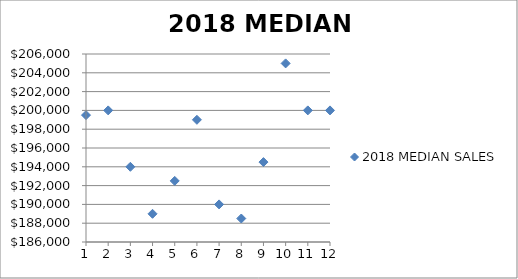
| Category | 2018 MEDIAN SALES |
|---|---|
| 1.0 | 199500 |
| 2.0 | 200000 |
| 3.0 | 194000 |
| 4.0 | 189000 |
| 5.0 | 192500 |
| 6.0 | 199000 |
| 7.0 | 190000 |
| 8.0 | 188500 |
| 9.0 | 194500 |
| 10.0 | 205000 |
| 11.0 | 200000 |
| 12.0 | 200000 |